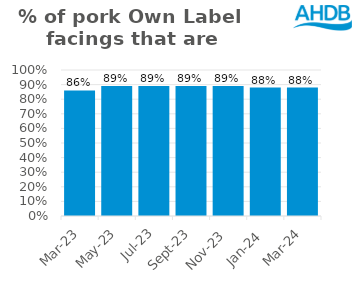
| Category | Pork |
|---|---|
| 2023-03-01 | 0.86 |
| 2023-05-01 | 0.89 |
| 2023-07-01 | 0.89 |
| 2023-09-01 | 0.89 |
| 2023-11-01 | 0.89 |
| 2024-01-01 | 0.88 |
| 2024-03-01 | 0.88 |